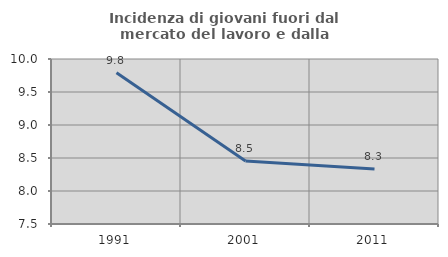
| Category | Incidenza di giovani fuori dal mercato del lavoro e dalla formazione  |
|---|---|
| 1991.0 | 9.792 |
| 2001.0 | 8.454 |
| 2011.0 | 8.333 |